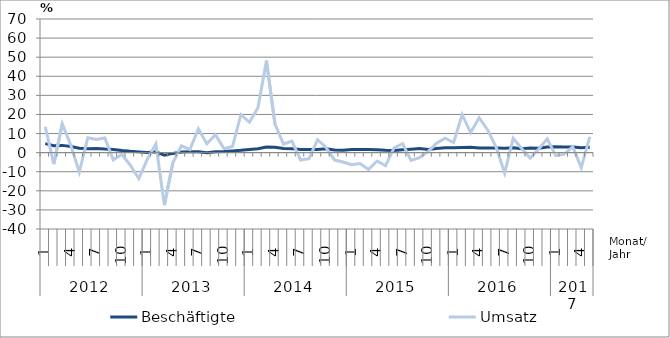
| Category | Beschäftigte | Umsatz |
|---|---|---|
| 0 | 4.7 | 13.5 |
| 1 | 3.6 | -6 |
| 2 | 3.8 | 15.1 |
| 3 | 3.2 | 3.9 |
| 4 | 2.3 | -10.2 |
| 5 | 2.1 | 7.8 |
| 6 | 2.2 | 6.9 |
| 7 | 1.9 | 7.7 |
| 8 | 1.7 | -3.8 |
| 9 | 1.1 | -0.9 |
| 10 | 0.7 | -6.6 |
| 11 | 0.4 | -13.6 |
| 12 | 0.1 | -3.4 |
| 13 | 0.4 | 4.5 |
| 14 | -1.3 | -27.5 |
| 15 | -0.4 | -5.3 |
| 16 | 0.3 | 3.6 |
| 17 | 0.4 | 1.6 |
| 18 | 0.4 | 12.4 |
| 19 | 0 | 4.7 |
| 20 | 0.5 | 9.4 |
| 21 | 0.6 | 2.1 |
| 22 | 0.9 | 3.2 |
| 23 | 1.2 | 19.9 |
| 24 | 1.6 | 15.9 |
| 25 | 2 | 23.5 |
| 26 | 2.9 | 48.2 |
| 27 | 2.8 | 14.9 |
| 28 | 2.2 | 4.5 |
| 29 | 2.1 | 6 |
| 30 | 1.6 | -3.9 |
| 31 | 1.6 | -3.2 |
| 32 | 1.6 | 6.8 |
| 33 | 2 | 2.7 |
| 34 | 1.4 | -3.9 |
| 35 | 1.3 | -4.9 |
| 36 | 1.7 | -6.3 |
| 37 | 1.7 | -5.7 |
| 38 | 1.7 | -8.8 |
| 39 | 1.5 | -4.4 |
| 40 | 1.2 | -6.8 |
| 41 | 1.1 | 2.5 |
| 42 | 1.5 | 4.7 |
| 43 | 1.8 | -4.1 |
| 44 | 2.1 | -2.6 |
| 45 | 1.6 | 0.5 |
| 46 | 2.2 | 4.9 |
| 47 | 2.6 | 7.6 |
| 48 | 2.5 | 5.3 |
| 49 | 2.7 | 19.9 |
| 50 | 2.8 | 10.5 |
| 51 | 2.4 | 18.3 |
| 52 | 2.4 | 11.9 |
| 53 | 2.4 | 2.8 |
| 54 | 2.3 | -10.7 |
| 55 | 2.5 | 7.5 |
| 56 | 2 | 2.2 |
| 57 | 2.4 | -2.9 |
| 58 | 2.3 | 1.9 |
| 59 | 2.9 | 7.2 |
| 60 | 3.1 | -1.6 |
| 61 | 3 | -0.8 |
| 62 | 3 | 3.1 |
| 63 | 2.5 | -7.8 |
| 64 | 2.8 | 8.3 |